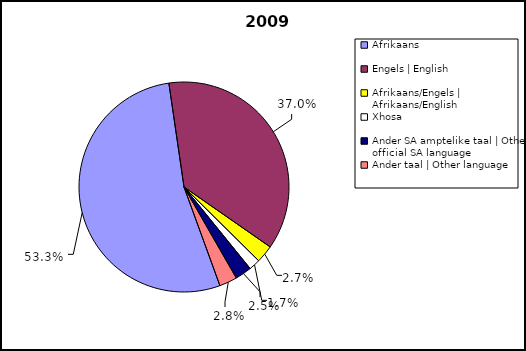
| Category | Series 0 |
|---|---|
| Afrikaans | 13975 |
| Engels | English | 9704 |
| Afrikaans/Engels | Afrikaans/English | 717 |
| Xhosa | 458 |
| Ander SA amptelike taal | Other official SA language | 668 |
| Ander taal | Other language | 721 |